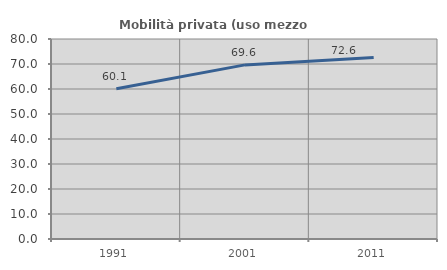
| Category | Mobilità privata (uso mezzo privato) |
|---|---|
| 1991.0 | 60.136 |
| 2001.0 | 69.641 |
| 2011.0 | 72.589 |